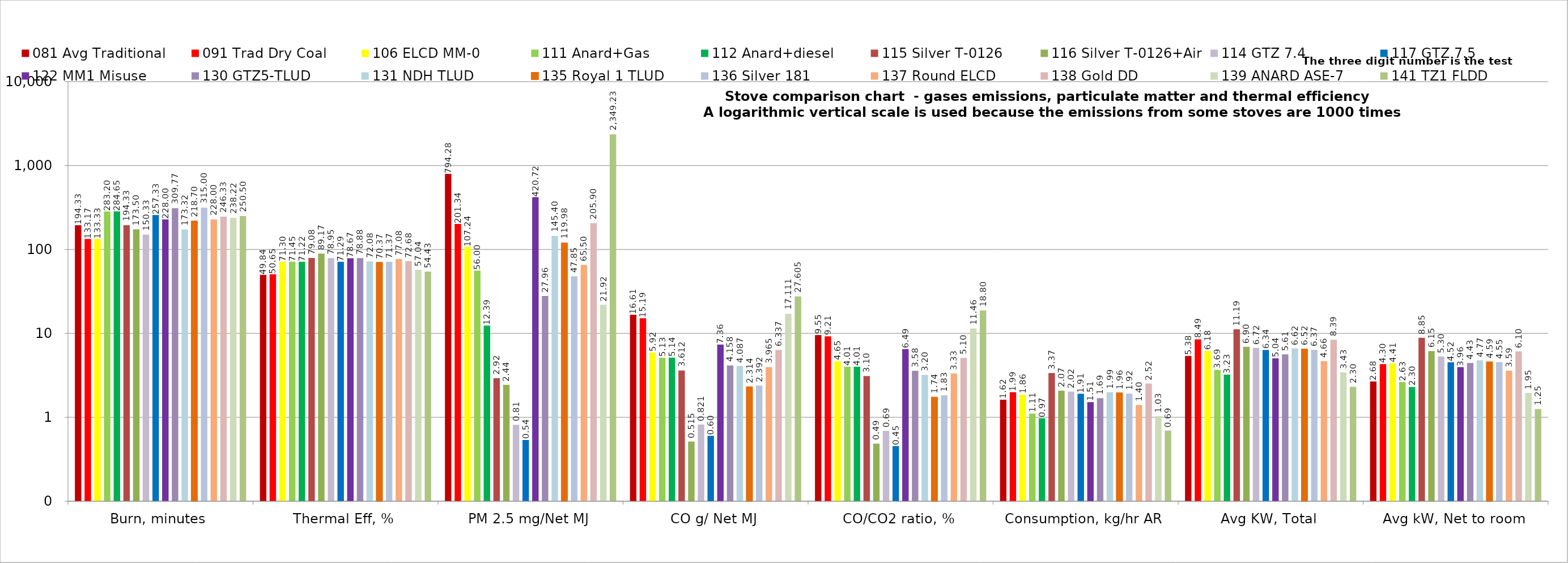
| Category | 081 Avg Traditional | 091 Trad Dry Coal | 106 ELCD MM-0 | 111 Anard+Gas | 112 Anard+diesel | 115 Silver T-0126 | 116 Silver T-0126+Air | 114 GTZ 7.4 | 117 GTZ 7.5 | 122 MM1 Misuse | 130 GTZ5-TLUD | 131 NDH TLUD | 135 Royal 1 TLUD | 136 Silver 181 | 137 Round ELCD | 138 Gold DD | 139 ANARD ASE-7 | 141 TZ1 FLDD |
|---|---|---|---|---|---|---|---|---|---|---|---|---|---|---|---|---|---|---|
| Burn, minutes | 194.333 | 133.167 | 133.333 | 283.2 | 284.65 | 194.333 | 173.5 | 150.333 | 257.333 | 228 | 309.767 | 173.317 | 218.7 | 315 | 228 | 246.333 | 238.217 | 250.5 |
| Thermal Eff, % | 49.844 | 50.65 | 71.304 | 71.454 | 71.222 | 79.084 | 89.166 | 78.953 | 71.293 | 78.667 | 78.883 | 72.081 | 70.368 | 71.369 | 77.083 | 72.684 | 57.041 | 54.435 |
| PM 2.5 mg/Net MJ | 794.279 | 201.34 | 107.243 | 56.003 | 12.386 | 2.922 | 2.44 | 0.812 | 0.537 | 420.718 | 27.96 | 145.401 | 119.977 | 47.852 | 65.496 | 205.9 | 21.917 | 2349.229 |
| CO g/ Net MJ | 16.614 | 15.188 | 5.923 | 5.13 | 5.135 | 3.612 | 0.515 | 0.821 | 0.601 | 7.359 | 4.158 | 4.087 | 2.314 | 2.392 | 3.965 | 6.337 | 17.111 | 27.605 |
| CO/CO2 ratio, % | 9.554 | 9.207 | 4.655 | 4.015 | 4.006 | 3.102 | 0.486 | 0.688 | 0.454 | 6.493 | 3.577 | 3.201 | 1.744 | 1.831 | 3.325 | 5.098 | 11.456 | 18.8 |
| Consumption, kg/hr AR | 1.617 | 1.993 | 1.859 | 1.109 | 0.971 | 3.366 | 2.074 | 2.02 | 1.907 | 1.514 | 1.688 | 1.991 | 1.962 | 1.916 | 1.402 | 2.523 | 1.031 | 0.693 |
| Avg KW, Total | 5.378 | 8.495 | 6.183 | 3.686 | 3.23 | 11.194 | 6.899 | 6.719 | 6.341 | 5.036 | 5.614 | 6.62 | 6.524 | 6.371 | 4.662 | 8.39 | 3.427 | 2.304 |
| Avg kW, Net to room | 2.68 | 4.303 | 4.409 | 2.634 | 2.301 | 8.853 | 6.151 | 5.305 | 4.521 | 3.961 | 4.429 | 4.772 | 4.591 | 4.547 | 3.594 | 6.098 | 1.955 | 1.254 |